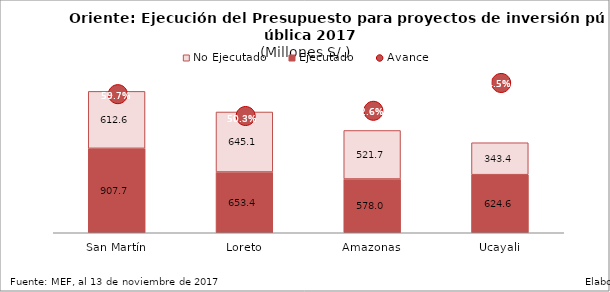
| Category | Ejecutado | No Ejecutado |
|---|---|---|
| San Martín | 907.727 | 612.57 |
| Loreto | 653.435 | 645.149 |
| Amazonas | 577.997 | 521.692 |
| Ucayali | 624.613 | 343.422 |